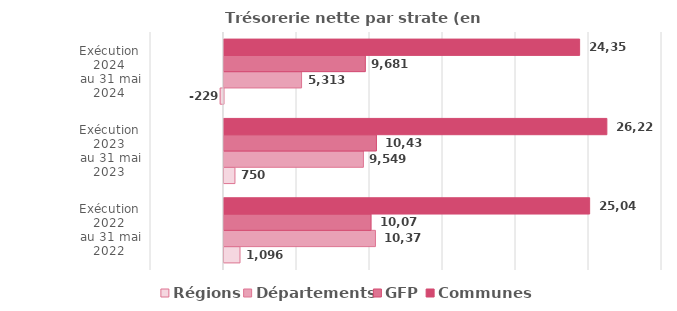
| Category | Régions | Départements | GFP | Communes  |
|---|---|---|---|---|
| Exécution 2022
 au 31 mai 2022 | 1096.3 | 10372.6 | 10073.8 | 25044.4 |
| Exécution 2023
 au 31 mai 2023 | 750.2 | 9548.8 | 10439 | 26223.3 |
| Exécution 2024
 au 31 mai 2024 | -228.8 | 5313.1 | 9680.6 | 24358.3 |